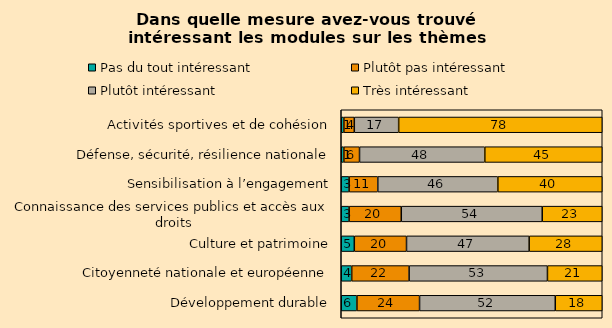
| Category | Pas du tout intéressant | Plutôt pas intéressant | Plutôt intéressant | Très intéressant |
|---|---|---|---|---|
| Activités sportives et de cohésion | 1 | 4 | 17 | 78 |
| Défense, sécurité, résilience nationale | 1 | 6 | 48 | 45 |
| Sensibilisation à l’engagement | 3 | 11 | 46 | 40 |
| Connaissance des services publics et accès aux droits | 3 | 20 | 54 | 23 |
| Culture et patrimoine | 5 | 20 | 47 | 28 |
| Citoyenneté nationale et européenne | 4 | 22 | 53 | 21 |
| Développement durable | 6 | 24 | 52 | 18 |